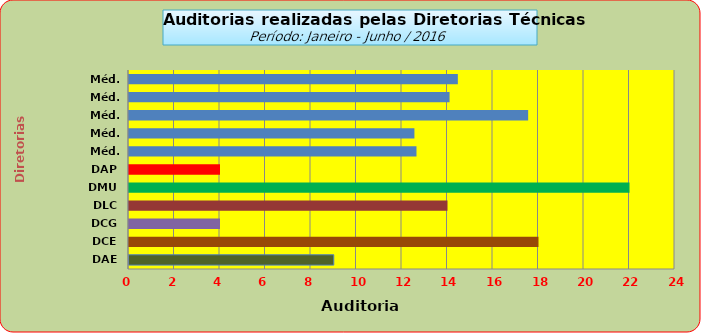
| Category | Series 0 |
|---|---|
| DAE | 9 |
| DCE | 18 |
| DCG | 4 |
| DLC | 14 |
| DMU | 22 |
| DAP | 4 |
| Méd. 2011 | 12.636 |
| Méd. 2012 | 12.545 |
| Méd. 2013 | 17.545 |
| Méd. 2014 | 14.091 |
| Méd. 2014 | 14.455 |